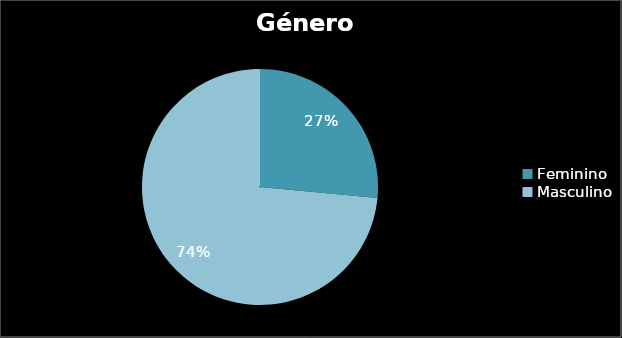
| Category | Género |
|---|---|
| Feminino | 26.486 |
| Masculino | 73.514 |